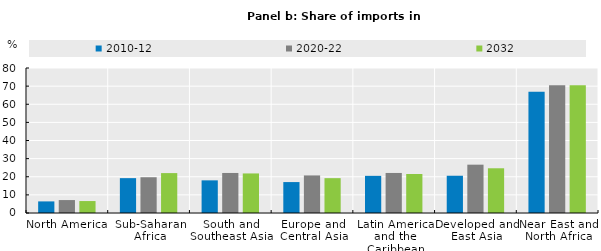
| Category | 2010-12 | 2020-22 | 2032 |
|---|---|---|---|
| North America | 6.396 | 7.134 | 6.591 |
| Sub-Saharan Africa | 19.232 | 19.73 | 22.017 |
| South and Southeast Asia | 18.015 | 22.086 | 21.825 |
| Europe and Central Asia | 17.064 | 20.725 | 19.221 |
| Latin America and the Caribbean | 20.498 | 22.09 | 21.524 |
| Developed and East Asia | 20.556 | 26.663 | 24.675 |
| Near East and North Africa | 66.926 | 70.513 | 70.5 |